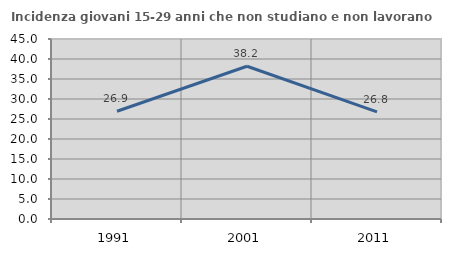
| Category | Incidenza giovani 15-29 anni che non studiano e non lavorano  |
|---|---|
| 1991.0 | 26.943 |
| 2001.0 | 38.188 |
| 2011.0 | 26.768 |